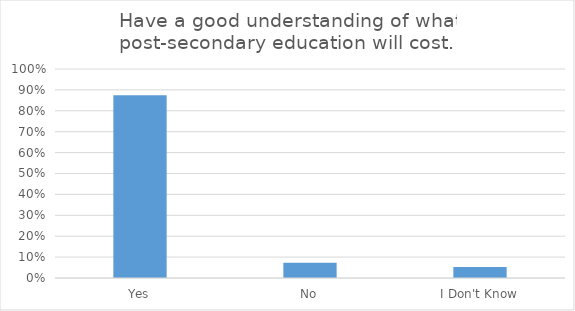
| Category | Have a good understanding of what post-secondary education will cost.  |
|---|---|
| Yes | 0.875 |
| No | 0.073 |
| I Don't Know | 0.052 |